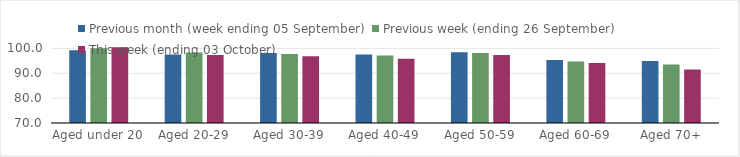
| Category | Previous month (week ending 05 September) | Previous week (ending 26 September) | This week (ending 03 October) |
|---|---|---|---|
| Aged under 20 | 99.22 | 100.07 | 100.52 |
| Aged 20-29 | 97.59 | 98.34 | 97.38 |
| Aged 30-39 | 98.17 | 97.71 | 96.85 |
| Aged 40-49 | 97.53 | 97.2 | 95.88 |
| Aged 50-59 | 98.5 | 98.14 | 97.38 |
| Aged 60-69 | 95.37 | 94.71 | 94.14 |
| Aged 70+ | 94.97 | 93.55 | 91.48 |